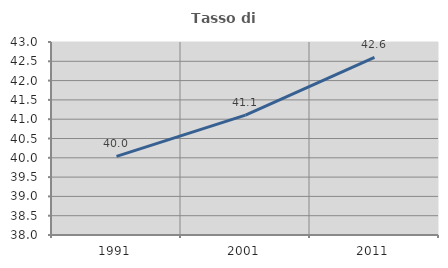
| Category | Tasso di occupazione   |
|---|---|
| 1991.0 | 40.037 |
| 2001.0 | 41.105 |
| 2011.0 | 42.604 |